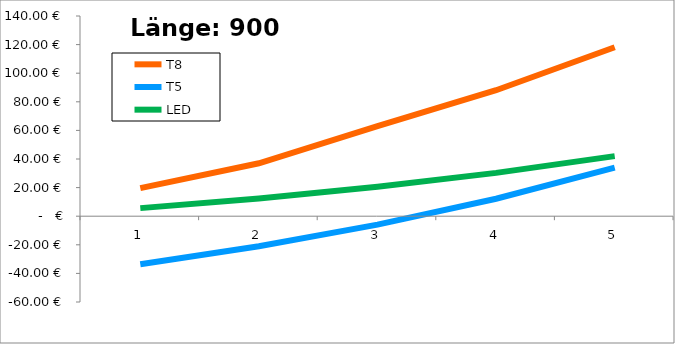
| Category | T8 | T5 | LED |
|---|---|---|---|
| 0 | 19.599 | -33.567 | 5.645 |
| 1 | 37.017 | -20.987 | 12.419 |
| 2 | 63.002 | -5.891 | 20.547 |
| 3 | 88.084 | 12.224 | 30.301 |
| 4 | 118.183 | 33.962 | 42.006 |